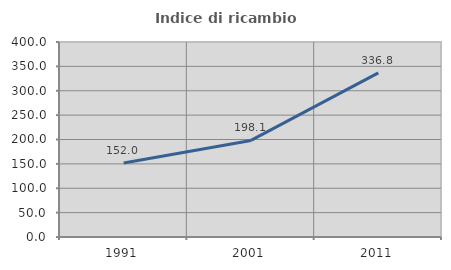
| Category | Indice di ricambio occupazionale  |
|---|---|
| 1991.0 | 151.974 |
| 2001.0 | 198.077 |
| 2011.0 | 336.8 |